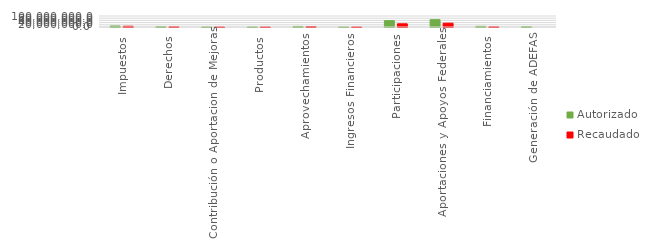
| Category | Autorizado | Recaudado |
|---|---|---|
| Impuestos | 9314383 | 6852015 |
| Derechos | 2568365 | 1638753.5 |
| Contribución o Aportacion de Mejoras | 164609 | 97778.7 |
| Productos | 246094 | 137700 |
| Aprovechamientos | 5092127.3 | 3326120.2 |
| Ingresos Financieros | 250000 | 192762.4 |
| Participaciones | 58073903 | 29252035.7 |
| Aportaciones y Apoyos Federales | 66633413 | 34566061.9 |
| Financiamientos | 6000000 | 1309134.5 |
| Generación de ADEFAS | 2460661 | 0 |